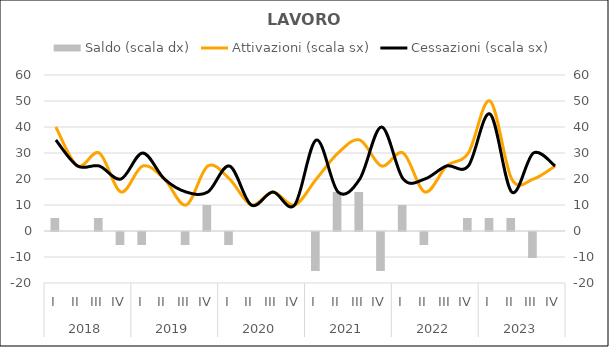
| Category | Saldo (scala dx) |
|---|---|
| 0 | 5 |
| 1 | 0 |
| 2 | 5 |
| 3 | -5 |
| 4 | -5 |
| 5 | 0 |
| 6 | -5 |
| 7 | 10 |
| 8 | -5 |
| 9 | 0 |
| 10 | 0 |
| 11 | 0 |
| 12 | -15 |
| 13 | 15 |
| 14 | 15 |
| 15 | -15 |
| 16 | 10 |
| 17 | -5 |
| 18 | 0 |
| 19 | 5 |
| 20 | 5 |
| 21 | 5 |
| 22 | -10 |
| 23 | 0 |